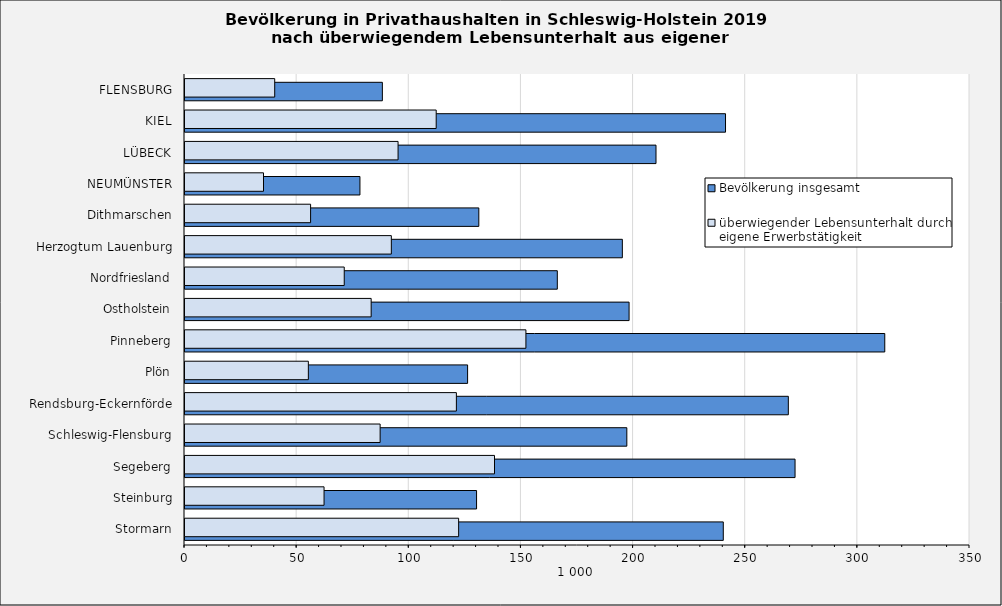
| Category | Bevölkerung insgesamt | überwiegender Lebensunterhalt durch eigene Erwerbstätigkeit |
|---|---|---|
| Stormarn | 240 | 122 |
| Steinburg | 130 | 62 |
| Segeberg | 272 | 138 |
| Schleswig-Flensburg | 197 | 87 |
| Rendsburg-Eckernförde | 269 | 121 |
| Plön | 126 | 55 |
| Pinneberg | 312 | 152 |
| Ostholstein | 198 | 83 |
| Nordfriesland | 166 | 71 |
| Herzogtum Lauenburg | 195 | 92 |
| Dithmarschen | 131 | 56 |
| NEUMÜNSTER | 78 | 35 |
| LÜBECK | 210 | 95 |
| KIEL | 241 | 112 |
| FLENSBURG | 88 | 40 |